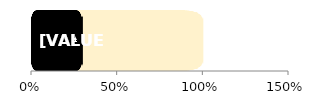
| Category | Total | Women |
|---|---|---|
| 0 | 1 | 0.297 |